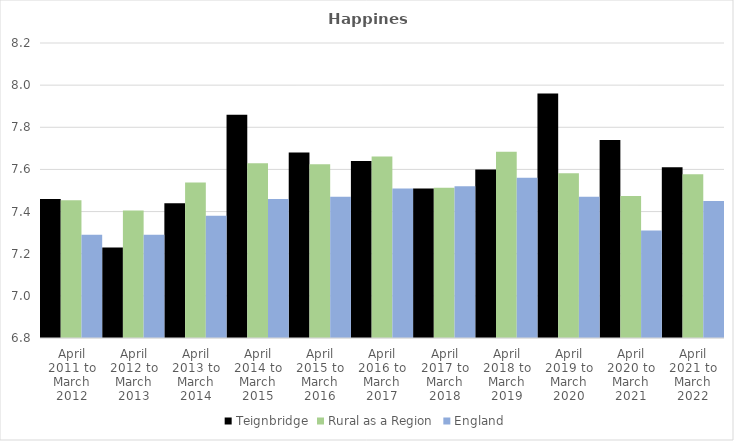
| Category | Teignbridge | Rural as a Region | England |
|---|---|---|---|
| April 2011 to March 2012 | 7.46 | 7.454 | 7.29 |
| April 2012 to March 2013 | 7.23 | 7.406 | 7.29 |
| April 2013 to March 2014 | 7.44 | 7.539 | 7.38 |
| April 2014 to March 2015 | 7.86 | 7.63 | 7.46 |
| April 2015 to March 2016 | 7.68 | 7.625 | 7.47 |
| April 2016 to March 2017 | 7.64 | 7.661 | 7.51 |
| April 2017 to March 2018 | 7.51 | 7.513 | 7.52 |
| April 2018 to March 2019 | 7.6 | 7.684 | 7.56 |
| April 2019 to March 2020 | 7.96 | 7.582 | 7.47 |
| April 2020 to March 2021 | 7.74 | 7.474 | 7.31 |
| April 2021 to March 2022 | 7.61 | 7.577 | 7.45 |